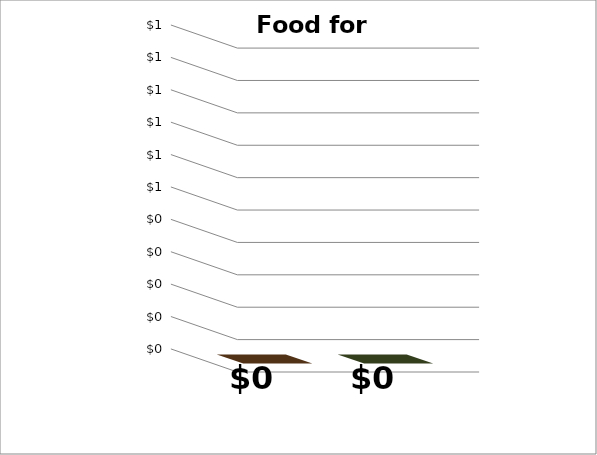
| Category | Series 0 |
|---|---|
| What You're Spending on Food | 0 |
| What the Average Canadian Household Your Size Spends on Food | 0 |